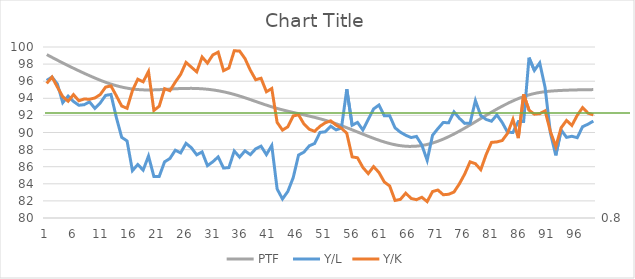
| Category | PTF  |
|---|---|
| 0 | 99.111 |
| 1 | 98.765 |
| 2 | 98.425 |
| 3 | 98.092 |
| 4 | 97.767 |
| 5 | 97.449 |
| 6 | 97.14 |
| 7 | 96.839 |
| 8 | 96.548 |
| 9 | 96.269 |
| 10 | 96.008 |
| 11 | 95.771 |
| 12 | 95.56 |
| 13 | 95.381 |
| 14 | 95.234 |
| 15 | 95.121 |
| 16 | 95.04 |
| 17 | 94.992 |
| 18 | 94.974 |
| 19 | 94.98 |
| 20 | 95.004 |
| 21 | 95.039 |
| 22 | 95.078 |
| 23 | 95.114 |
| 24 | 95.143 |
| 25 | 95.16 |
| 26 | 95.161 |
| 27 | 95.144 |
| 28 | 95.106 |
| 29 | 95.046 |
| 30 | 94.962 |
| 31 | 94.854 |
| 32 | 94.72 |
| 33 | 94.561 |
| 34 | 94.379 |
| 35 | 94.178 |
| 36 | 93.963 |
| 37 | 93.737 |
| 38 | 93.509 |
| 39 | 93.284 |
| 40 | 93.071 |
| 41 | 92.874 |
| 42 | 92.694 |
| 43 | 92.528 |
| 44 | 92.374 |
| 45 | 92.226 |
| 46 | 92.08 |
| 47 | 91.931 |
| 48 | 91.774 |
| 49 | 91.605 |
| 50 | 91.42 |
| 51 | 91.218 |
| 52 | 90.997 |
| 53 | 90.76 |
| 54 | 90.51 |
| 55 | 90.251 |
| 56 | 89.989 |
| 57 | 89.728 |
| 58 | 89.471 |
| 59 | 89.227 |
| 60 | 89 |
| 61 | 88.798 |
| 62 | 88.629 |
| 63 | 88.498 |
| 64 | 88.412 |
| 65 | 88.373 |
| 66 | 88.385 |
| 67 | 88.449 |
| 68 | 88.565 |
| 69 | 88.731 |
| 70 | 88.943 |
| 71 | 89.197 |
| 72 | 89.488 |
| 73 | 89.812 |
| 74 | 90.161 |
| 75 | 90.531 |
| 76 | 90.914 |
| 77 | 91.305 |
| 78 | 91.699 |
| 79 | 92.089 |
| 80 | 92.47 |
| 81 | 92.838 |
| 82 | 93.188 |
| 83 | 93.514 |
| 84 | 93.813 |
| 85 | 94.079 |
| 86 | 94.307 |
| 87 | 94.493 |
| 88 | 94.637 |
| 89 | 94.744 |
| 90 | 94.819 |
| 91 | 94.873 |
| 92 | 94.912 |
| 93 | 94.942 |
| 94 | 94.965 |
| 95 | 94.983 |
| 96 | 94.997 |
| 97 | 95.009 |
| 98 | 95.016 |